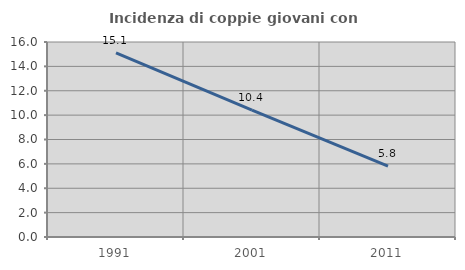
| Category | Incidenza di coppie giovani con figli |
|---|---|
| 1991.0 | 15.1 |
| 2001.0 | 10.418 |
| 2011.0 | 5.806 |